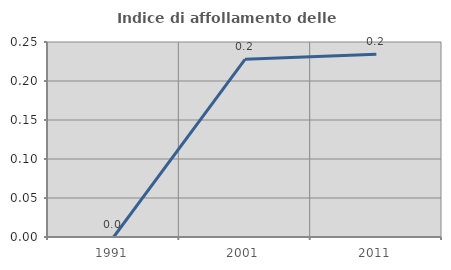
| Category | Indice di affollamento delle abitazioni  |
|---|---|
| 1991.0 | 0 |
| 2001.0 | 0.228 |
| 2011.0 | 0.234 |